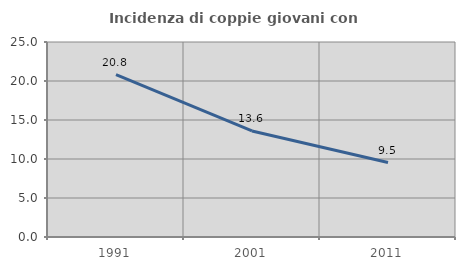
| Category | Incidenza di coppie giovani con figli |
|---|---|
| 1991.0 | 20.808 |
| 2001.0 | 13.599 |
| 2011.0 | 9.541 |